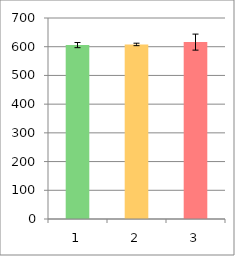
| Category | Series 0 |
|---|---|
| 0 | 605.654 |
| 1 | 607.939 |
| 2 | 616.008 |